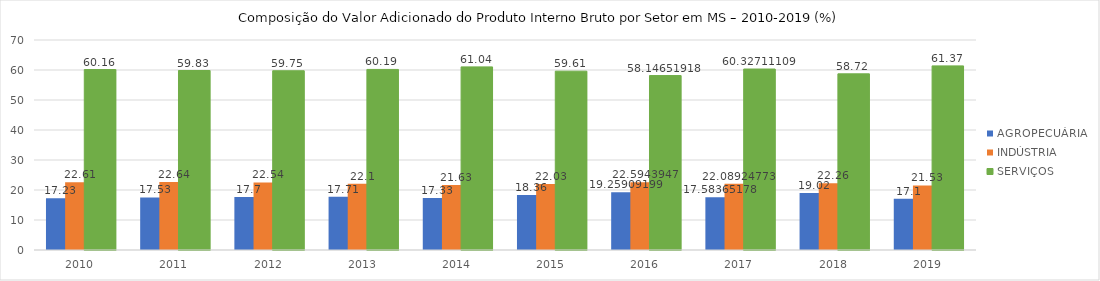
| Category | AGROPECUÁRIA | INDÚSTRIA | SERVIÇOS |
|---|---|---|---|
| 2010.0 | 17.23 | 22.61 | 60.16 |
| 2011.0 | 17.53 | 22.64 | 59.83 |
| 2012.0 | 17.7 | 22.54 | 59.75 |
| 2013.0 | 17.71 | 22.1 | 60.19 |
| 2014.0 | 17.33 | 21.63 | 61.04 |
| 2015.0 | 18.36 | 22.03 | 59.61 |
| 2016.0 | 19.259 | 22.594 | 58.147 |
| 2017.0 | 17.584 | 22.089 | 60.327 |
| 2018.0 | 19.02 | 22.26 | 58.72 |
| 2019.0 | 17.1 | 21.53 | 61.37 |